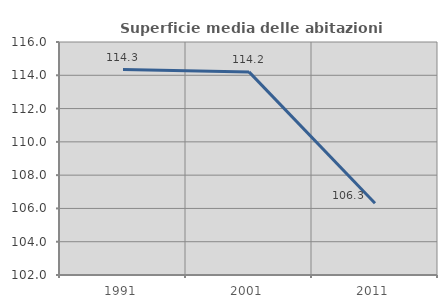
| Category | Superficie media delle abitazioni occupate |
|---|---|
| 1991.0 | 114.343 |
| 2001.0 | 114.203 |
| 2011.0 | 106.315 |